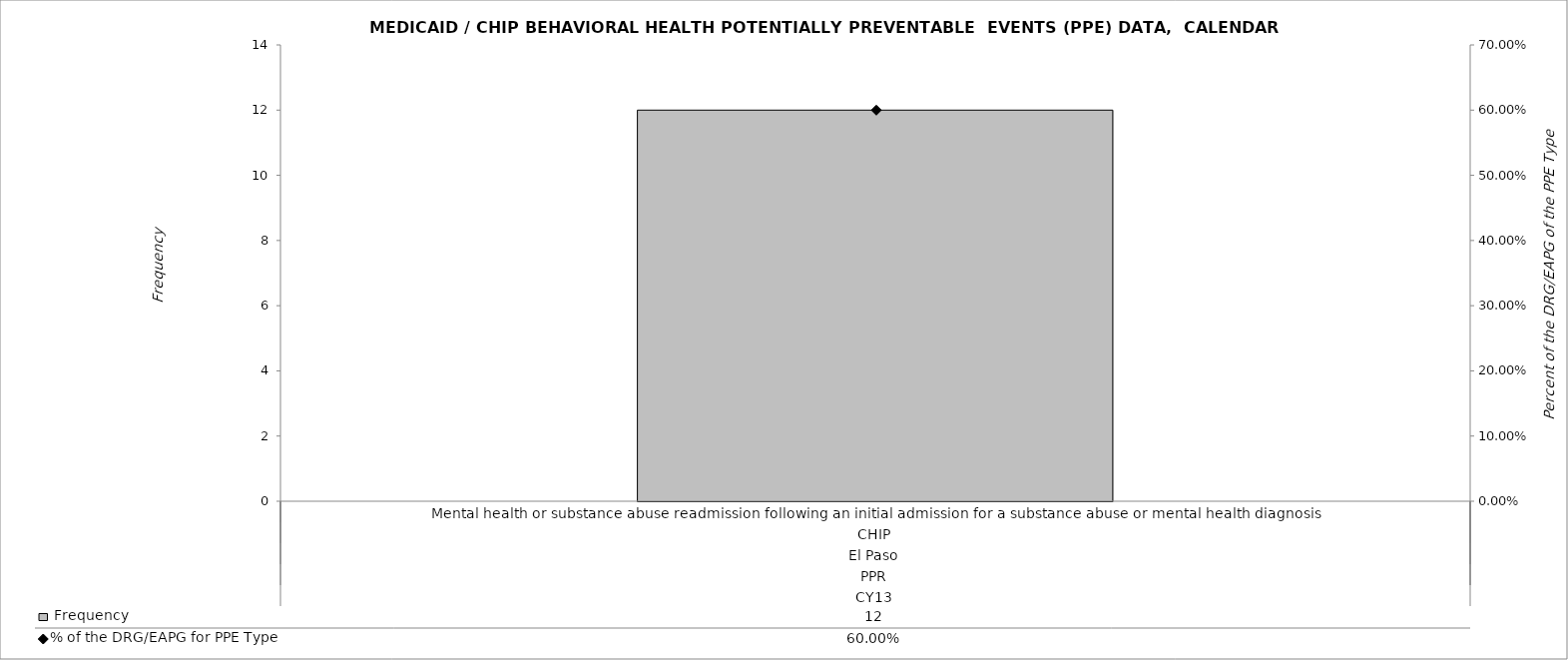
| Category |  Frequency |
|---|---|
| 0 | 12 |